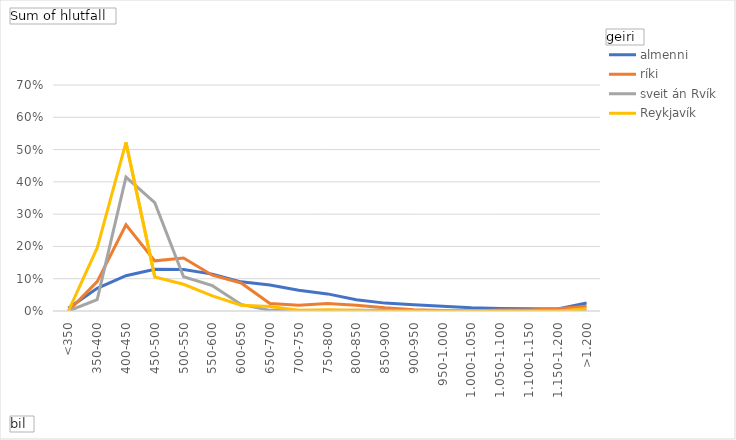
| Category | almenni | ríki | sveit án Rvík | Reykjavík |
|---|---|---|---|---|
| <350 | 0.008 | 0 | 0 | 0 |
| 350-400 | 0.07 | 0.091 | 0.035 | 0.195 |
| 400-450 | 0.109 | 0.267 | 0.415 | 0.522 |
| 450-500 | 0.13 | 0.155 | 0.335 | 0.106 |
| 500-550 | 0.128 | 0.164 | 0.106 | 0.083 |
| 550-600 | 0.114 | 0.111 | 0.078 | 0.047 |
| 600-650 | 0.09 | 0.087 | 0.02 | 0.018 |
| 650-700 | 0.08 | 0.023 | 0.002 | 0.014 |
| 700-750 | 0.064 | 0.018 | 0.002 | 0.002 |
| 750-800 | 0.053 | 0.023 | 0.001 | 0.004 |
| 800-850 | 0.035 | 0.018 | 0.002 | 0.002 |
| 850-900 | 0.024 | 0.01 | 0.002 | 0 |
| 900-950 | 0.019 | 0.004 | 0 | 0 |
| 950-1.000 | 0.014 | 0.001 | 0 | 0 |
| 1.000-1.050 | 0.01 | 0 | 0 | 0 |
| 1.050-1.100 | 0.008 | 0.003 | 0 | 0 |
| 1.100-1.150 | 0.007 | 0.003 | 0 | 0 |
| 1.150-1.200 | 0.006 | 0.007 | 0 | 0 |
| >1.200 | 0.025 | 0.014 | 0 | 0.007 |